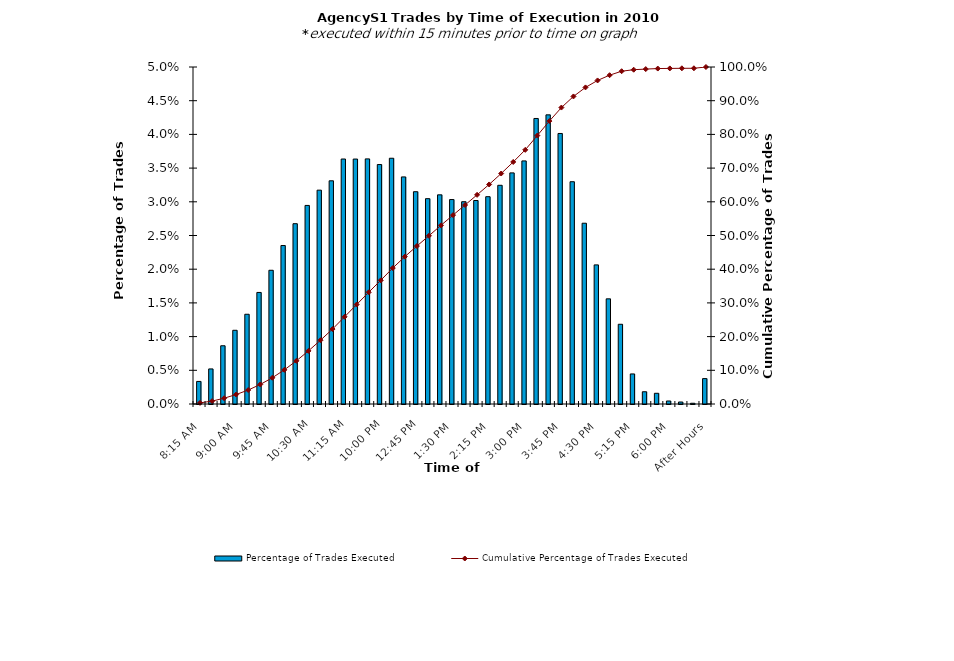
| Category | Percentage of Trades Executed |
|---|---|
| 8:15 AM | 0.003 |
| 8:30 AM | 0.005 |
| 8:45 AM | 0.009 |
| 9:00 AM | 0.011 |
| 9:15 AM | 0.013 |
| 9:30 AM | 0.017 |
| 9:45 AM | 0.02 |
| 10:00 AM | 0.024 |
| 10:15 AM | 0.027 |
| 10:30 AM | 0.029 |
| 10:45 AM | 0.032 |
| 11:00 AM | 0.033 |
| 11:15 AM | 0.036 |
| 11:30 AM | 0.036 |
| 11:45 AM | 0.036 |
| 12:00 PM | 0.036 |
| 12:15 PM | 0.036 |
| 12:30 PM | 0.034 |
| 12:45 PM | 0.031 |
| 1:00 PM | 0.03 |
| 1:15 PM | 0.031 |
| 1:30 PM | 0.03 |
| 1:45 PM | 0.03 |
| 2:00 PM | 0.03 |
| 2:15 PM | 0.031 |
| 2:30 PM | 0.032 |
| 2:45 PM | 0.034 |
| 3:00 PM | 0.036 |
| 3:15 PM | 0.042 |
| 3:30 PM | 0.043 |
| 3:45 PM | 0.04 |
| 4:00 PM | 0.033 |
| 4:15 PM | 0.027 |
| 4:30 PM | 0.021 |
| 4:45 PM | 0.016 |
| 5:00 PM | 0.012 |
| 5:15 PM | 0.004 |
| 5:30 PM | 0.002 |
| 5:45 PM | 0.002 |
| 6:00 PM | 0 |
| 6:15 PM | 0 |
| 6:30 PM | 0 |
| After Hours | 0.004 |